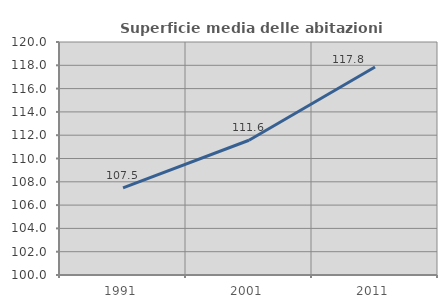
| Category | Superficie media delle abitazioni occupate |
|---|---|
| 1991.0 | 107.481 |
| 2001.0 | 111.568 |
| 2011.0 | 117.849 |